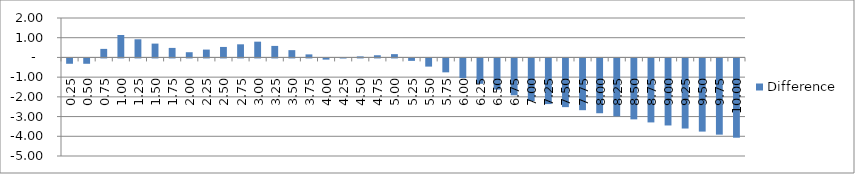
| Category | Difference |
|---|---|
| 0.25 | -0.271 |
| 0.5 | -0.271 |
| 0.75 | 0.434 |
| 1.0 | 1.138 |
| 1.25 | 0.92 |
| 1.5 | 0.701 |
| 1.75 | 0.483 |
| 2.0 | 0.264 |
| 2.25 | 0.398 |
| 2.5 | 0.532 |
| 2.75 | 0.666 |
| 3.0 | 0.799 |
| 3.25 | 0.584 |
| 3.5 | 0.369 |
| 3.75 | 0.155 |
| 4.0 | -0.06 |
| 4.25 | -0.004 |
| 4.5 | 0.053 |
| 4.75 | 0.11 |
| 5.0 | 0.167 |
| 5.25 | -0.124 |
| 5.5 | -0.415 |
| 5.75 | -0.706 |
| 6.0 | -0.997 |
| 6.25 | -1.288 |
| 6.5 | -1.578 |
| 6.75 | -1.869 |
| 7.0 | -2.16 |
| 7.25 | -2.315 |
| 7.5 | -2.47 |
| 7.75 | -2.626 |
| 8.0 | -2.781 |
| 8.25 | -2.936 |
| 8.5 | -3.091 |
| 8.75 | -3.246 |
| 9.0 | -3.401 |
| 9.25 | -3.556 |
| 9.5 | -3.711 |
| 9.75 | -3.866 |
| 10.0 | -4.021 |